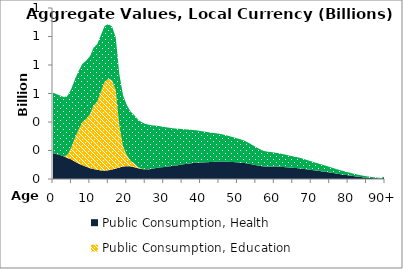
| Category | Public Consumption, Health | Public Consumption, Education | Public Consumption, Other than health and education |
|---|---|---|---|
| 0 | 181.392 | 0 | 424.615 |
|  | 174.145 | 0 | 420.827 |
| 2 | 167.344 | 0 | 417.9 |
| 3 | 158.039 | 0 | 415.681 |
| 4 | 146.757 | 24.991 | 414.015 |
| 5 | 136.594 | 86.294 | 412.747 |
| 6 | 120.806 | 170.289 | 411.723 |
| 7 | 107.274 | 242.456 | 410.788 |
| 8 | 96.344 | 303.097 | 409.787 |
| 9 | 86.519 | 335.093 | 408.567 |
| 10 | 76.235 | 378.06 | 407.285 |
| 11 | 69.835 | 444.971 | 406.102 |
| 12 | 64.805 | 477.943 | 403.294 |
| 13 | 60.067 | 553.456 | 398.081 |
| 14 | 58.728 | 624.63 | 391.249 |
| 15 | 60.785 | 641.855 | 384.344 |
| 16 | 66.425 | 626.849 | 377.031 |
| 17 | 73.264 | 551.113 | 370.054 |
| 18 | 80.301 | 289.528 | 363.929 |
| 19 | 88.064 | 139.84 | 358.278 |
| 20 | 89.388 | 77.954 | 352.228 |
| 21 | 88.582 | 40.091 | 345.98 |
| 22 | 82.518 | 27.086 | 339.471 |
| 23 | 76.21 | 9.22 | 332.59 |
| 24 | 70.201 | 3.098 | 325.45 |
| 25 | 67.569 | 1.483 | 318.326 |
| 26 | 68.55 | 1.103 | 311.221 |
| 27 | 72.314 | 0 | 303.988 |
| 28 | 77.538 | 0 | 296.599 |
| 29 | 81.316 | 0 | 289.155 |
| 30 | 83.654 | 0 | 281.769 |
| 31 | 87.14 | 0 | 274.403 |
| 32 | 90.428 | 0 | 267.401 |
| 33 | 93.36 | 0 | 260.939 |
| 34 | 97.533 | 0 | 254.876 |
| 35 | 102.347 | 0 | 248.866 |
| 36 | 105.52 | 0 | 242.947 |
| 37 | 108.761 | 0 | 237.227 |
| 38 | 112.403 | 0 | 231.717 |
| 39 | 114.824 | 0 | 226.366 |
| 40 | 115.73 | 0 | 221.078 |
| 41 | 116.856 | 0 | 215.828 |
| 42 | 118.083 | 0 | 210.657 |
| 43 | 119.154 | 0 | 205.561 |
| 44 | 121.104 | 0 | 200.482 |
| 45 | 122.558 | 0 | 195.302 |
| 46 | 122.999 | 0 | 189.972 |
| 47 | 121.93 | 0 | 184.584 |
| 48 | 119.929 | 0 | 179.148 |
| 49 | 118.789 | 0 | 173.556 |
| 50 | 116.738 | 0 | 167.956 |
| 51 | 114.514 | 0 | 162.638 |
| 52 | 111.924 | 0 | 155.931 |
| 53 | 107.294 | 0 | 147.122 |
| 54 | 102.24 | 0 | 137.129 |
| 55 | 97.264 | 0 | 127.433 |
| 56 | 92.319 | 0 | 117.554 |
| 57 | 88.642 | 0 | 109.527 |
| 58 | 87.763 | 0 | 104.456 |
| 59 | 88.022 | 0 | 101.349 |
| 60 | 87.623 | 0 | 98.064 |
| 61 | 86.668 | 0 | 94.971 |
| 62 | 84.86 | 0 | 91.81 |
| 63 | 82.838 | 0 | 88.219 |
| 64 | 80.51 | 0 | 84.359 |
| 65 | 78.406 | 0 | 80.799 |
| 66 | 76.564 | 0 | 77.478 |
| 67 | 74.191 | 0 | 73.784 |
| 68 | 71.05 | 0 | 69.486 |
| 69 | 67.239 | 0 | 64.812 |
| 70 | 63.773 | 0 | 60.241 |
| 71 | 60.297 | 0 | 55.708 |
| 72 | 56.913 | 0 | 51.259 |
| 73 | 53.525 | 0 | 46.975 |
| 74 | 49.927 | 0 | 42.842 |
| 75 | 46.074 | 0 | 38.774 |
| 76 | 41.634 | 0 | 34.797 |
| 77 | 37.307 | 0 | 31.035 |
| 78 | 33.345 | 0 | 27.546 |
| 79 | 29.693 | 0 | 24.305 |
| 80 | 25.971 | 0 | 21.223 |
| 81 | 22.078 | 0 | 18.31 |
| 82 | 18.414 | 0 | 15.667 |
| 83 | 15.147 | 0 | 13.333 |
| 84 | 12.38 | 0 | 11.269 |
| 85 | 9.91 | 0 | 9.386 |
| 86 | 7.557 | 0 | 7.685 |
| 87 | 5.675 | 0 | 6.206 |
| 88 | 4.387 | 0 | 4.952 |
| 89 | 3.344 | 0 | 3.898 |
| 90+ | 9.069 | 0 | 10.931 |